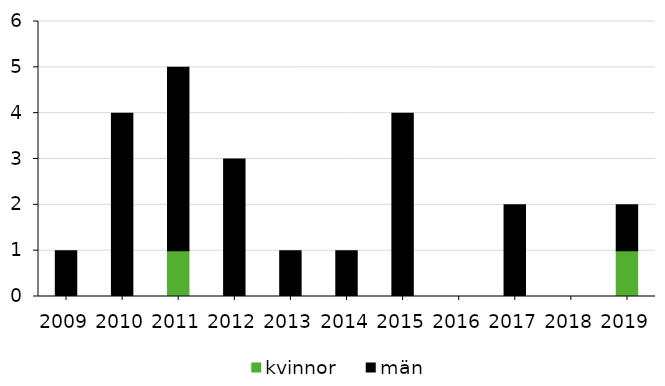
| Category | kvinnor | män |
|---|---|---|
| 2009 | 0 | 1 |
| 2010 | 0 | 4 |
| 2011 | 1 | 4 |
| 2012 | 0 | 3 |
| 2013 | 0 | 1 |
| 2014 | 0 | 1 |
| 2015 | 0 | 4 |
| 2016 | 0 | 0 |
| 2017 | 0 | 2 |
| 2018 | 0 | 0 |
| 2019 | 1 | 1 |